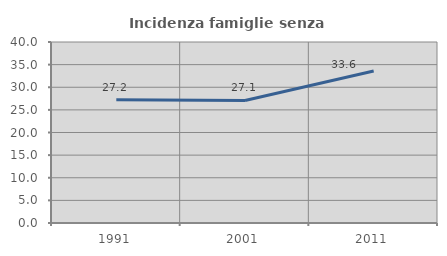
| Category | Incidenza famiglie senza nuclei |
|---|---|
| 1991.0 | 27.222 |
| 2001.0 | 27.074 |
| 2011.0 | 33.588 |